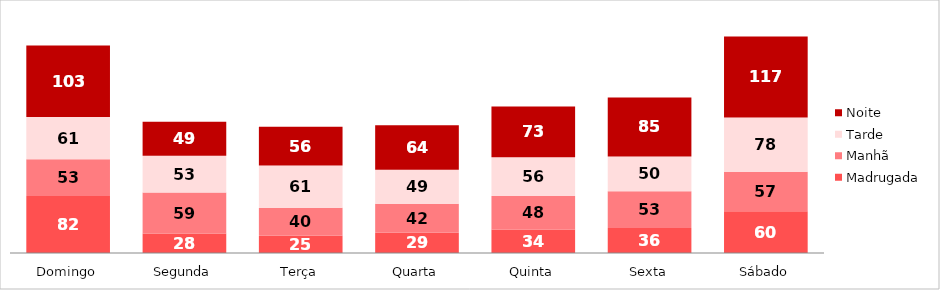
| Category | Madrugada | Manhã | Tarde | Noite |
|---|---|---|---|---|
| Domingo | 82 | 53 | 61 | 103 |
| Segunda | 28 | 59 | 53 | 49 |
| Terça | 25 | 40 | 61 | 56 |
| Quarta | 29 | 42 | 49 | 64 |
| Quinta | 34 | 48 | 56 | 73 |
| Sexta | 36 | 53 | 50 | 85 |
| Sábado | 60 | 57 | 78 | 117 |